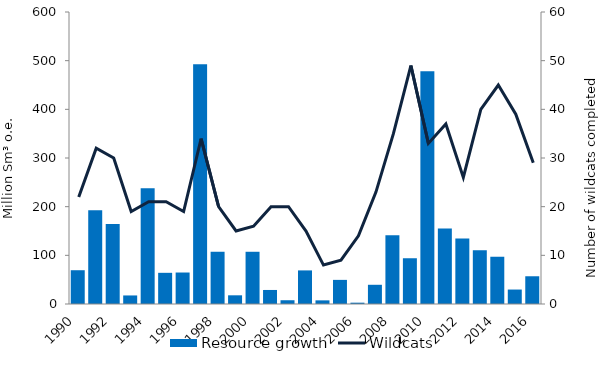
| Category | Resource growth |
|---|---|
| 1990.0 | 69.403 |
| 1991.0 | 192.721 |
| 1992.0 | 164.217 |
| 1993.0 | 17.571 |
| 1994.0 | 238.08 |
| 1995.0 | 64.063 |
| 1996.0 | 64.692 |
| 1997.0 | 492.88 |
| 1998.0 | 107.354 |
| 1999.0 | 17.857 |
| 2000.0 | 107.322 |
| 2001.0 | 28.834 |
| 2002.0 | 7.737 |
| 2003.0 | 69.031 |
| 2004.0 | 7.492 |
| 2005.0 | 49.559 |
| 2006.0 | 2.711 |
| 2007.0 | 39.482 |
| 2008.0 | 141.491 |
| 2009.0 | 94.017 |
| 2010.0 | 478.107 |
| 2011.0 | 154.965 |
| 2012.0 | 134.492 |
| 2013.0 | 110.464 |
| 2014.0 | 97.101 |
| 2015.0 | 29.697 |
| 2016.0 | 57 |